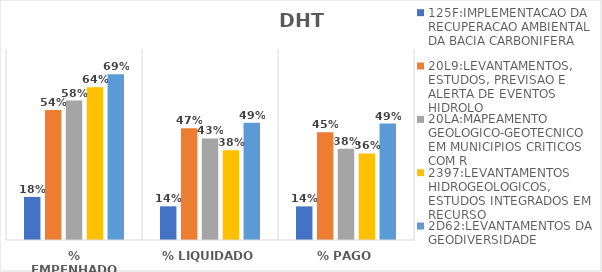
| Category | 125F:IMPLEMENTACAO DA RECUPERACAO AMBIENTAL DA BACIA CARBONIFERA | 20L9:LEVANTAMENTOS, ESTUDOS, PREVISAO E ALERTA DE EVENTOS HIDROLO | 20LA:MAPEAMENTO GEOLOGICO-GEOTECNICO EM MUNICIPIOS CRITICOS COM R | 2397:LEVANTAMENTOS HIDROGEOLOGICOS, ESTUDOS INTEGRADOS EM RECURSO | 2D62:LEVANTAMENTOS DA GEODIVERSIDADE |
|---|---|---|---|---|---|
| % EMPENHADO | 0.18 | 0.545 | 0.584 | 0.64 | 0.694 |
| % LIQUIDADO | 0.141 | 0.468 | 0.426 | 0.376 | 0.491 |
| % PAGO | 0.141 | 0.451 | 0.383 | 0.362 | 0.488 |